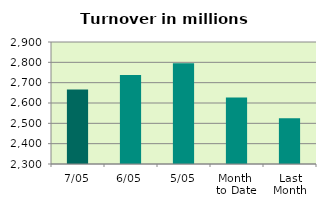
| Category | Series 0 |
|---|---|
| 7/05 | 2665.854 |
| 6/05 | 2738.285 |
| 5/05 | 2795.491 |
| Month 
to Date | 2627.537 |
| Last
Month | 2525.558 |